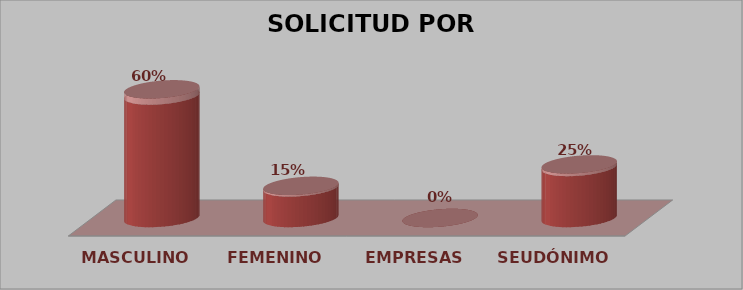
| Category | SOLICITUD POR GÉNERO | Series 1 |
|---|---|---|
| MASCULINO | 12 | 0.6 |
| FEMENINO | 3 | 0.15 |
| EMPRESAS | 0 | 0 |
| SEUDÓNIMO | 5 | 0.25 |